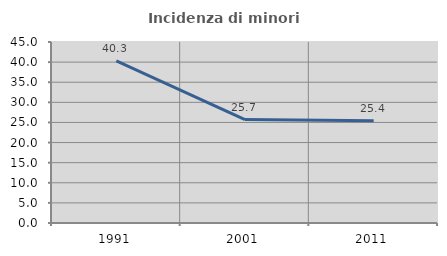
| Category | Incidenza di minori stranieri |
|---|---|
| 1991.0 | 40.323 |
| 2001.0 | 25.714 |
| 2011.0 | 25.439 |